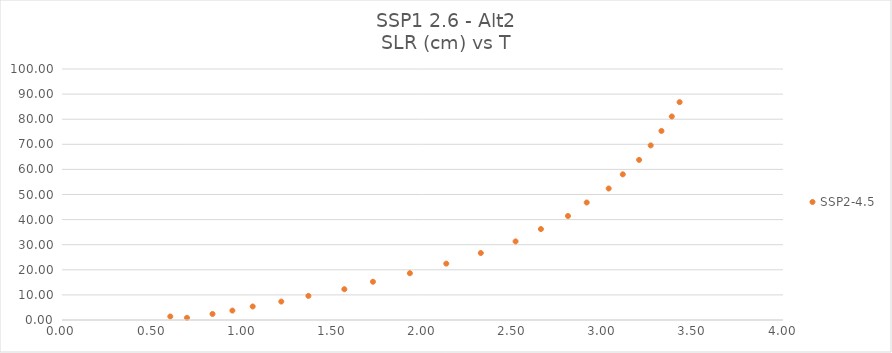
| Category | SSP2-4.5 |
|---|---|
| 0.693400617 | 0.87 |
| 0.600872844 | 1.399 |
| 0.835003234 | 2.407 |
| 0.945258389 | 3.755 |
| 1.057970477 | 5.386 |
| 1.216609042 | 7.344 |
| 1.366998793 | 9.606 |
| 1.566434093 | 12.264 |
| 1.725120317 | 15.242 |
| 1.930044464 | 18.639 |
| 2.131932338 | 22.459 |
| 2.323453638 | 26.683 |
| 2.516405038 | 31.319 |
| 2.657020005 | 36.232 |
| 2.807107579 | 41.44 |
| 2.911045411 | 46.811 |
| 3.032956146 | 52.386 |
| 3.111130619 | 58.034 |
| 3.201569044 | 63.784 |
| 3.265919987 | 69.553 |
| 3.325691587 | 75.324 |
| 3.383078307 | 81.085 |
| 3.426306042 | 86.795 |